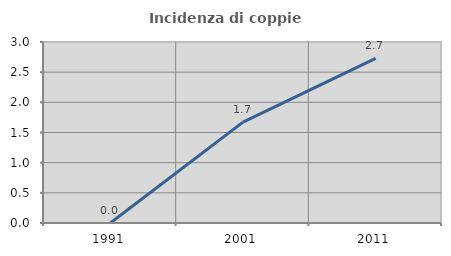
| Category | Incidenza di coppie miste |
|---|---|
| 1991.0 | 0 |
| 2001.0 | 1.672 |
| 2011.0 | 2.727 |